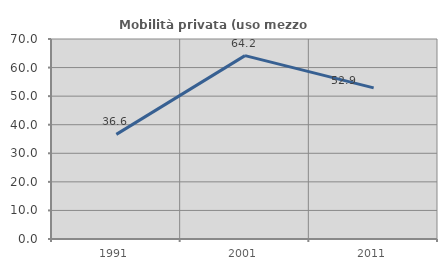
| Category | Mobilità privata (uso mezzo privato) |
|---|---|
| 1991.0 | 36.62 |
| 2001.0 | 64.179 |
| 2011.0 | 52.899 |